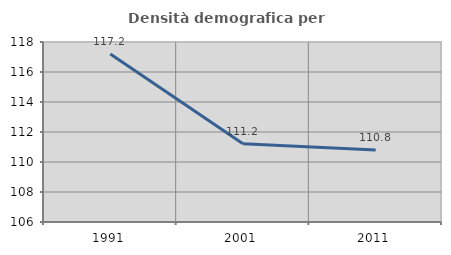
| Category | Densità demografica |
|---|---|
| 1991.0 | 117.205 |
| 2001.0 | 111.215 |
| 2011.0 | 110.799 |